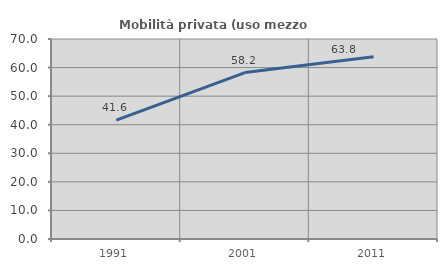
| Category | Mobilità privata (uso mezzo privato) |
|---|---|
| 1991.0 | 41.589 |
| 2001.0 | 58.235 |
| 2011.0 | 63.766 |